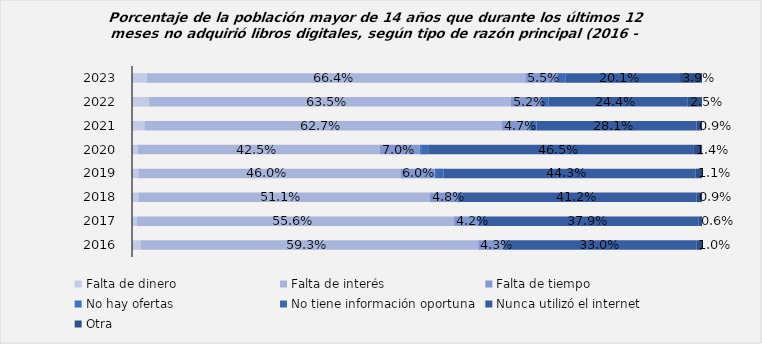
| Category | Falta de dinero | Falta de interés | Falta de tiempo | No hay ofertas | No tiene información oportuna | Nunca utilizó el internet | Otra |
|---|---|---|---|---|---|---|---|
| 2023.0 | 0.026 | 0.664 | 0.055 | 0.002 | 0.013 | 0.201 | 0.039 |
| 2022.0 | 0.03 | 0.635 | 0.052 | 0.001 | 0.013 | 0.244 | 0.025 |
| 2021.0 | 0.022 | 0.627 | 0.047 | 0.002 | 0.013 | 0.281 | 0.009 |
| 2020.0 | 0.011 | 0.425 | 0.07 | 0.002 | 0.014 | 0.465 | 0.014 |
| 2019.0 | 0.011 | 0.46 | 0.06 | 0.002 | 0.013 | 0.442 | 0.011 |
| 2018.0 | 0.011 | 0.511 | 0.048 | 0.001 | 0.008 | 0.412 | 0.009 |
| 2017.0 | 0.009 | 0.556 | 0.042 | 0.001 | 0.008 | 0.379 | 0.006 |
| 2016.0 | 0.015 | 0.592 | 0.043 | 0.002 | 0.008 | 0.33 | 0.01 |